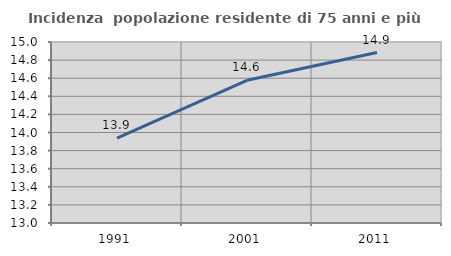
| Category | Incidenza  popolazione residente di 75 anni e più |
|---|---|
| 1991.0 | 13.937 |
| 2001.0 | 14.577 |
| 2011.0 | 14.883 |